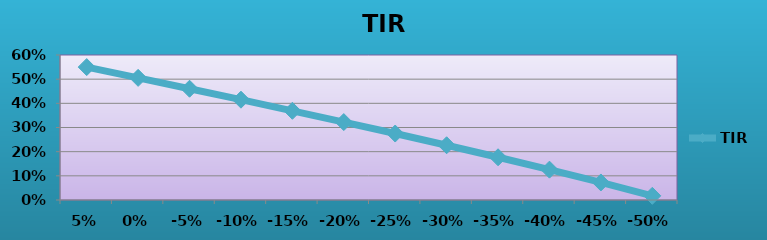
| Category | TIR |
|---|---|
| 0.05 | 0.55 |
| 0.0 | 0.505 |
| -0.05 | 0.46 |
| -0.1 | 0.415 |
| -0.15 | 0.369 |
| -0.2 | 0.322 |
| -0.25 | 0.275 |
| -0.3 | 0.227 |
| -0.35 | 0.177 |
| -0.4 | 0.126 |
| -0.45 | 0.073 |
| -0.5 | 0.017 |